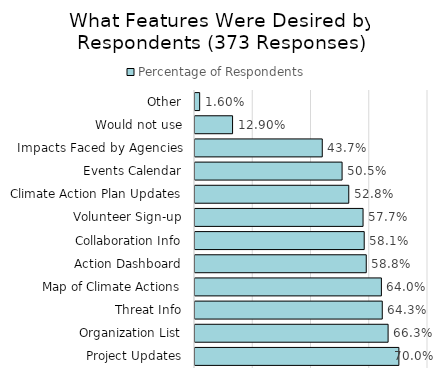
| Category | Percentage of Respondents |
|---|---|
| Project Updates | 0.7 |
| Organization List | 0.663 |
| Threat Info | 0.643 |
| Map of Climate Actions | 0.64 |
| Action Dashboard | 0.588 |
| Collaboration Info | 0.581 |
| Volunteer Sign-up | 0.577 |
| Climate Action Plan Updates | 0.528 |
| Events Calendar | 0.505 |
| Impacts Faced by Agencies | 0.437 |
| Would not use | 0.129 |
| Other | 0.016 |